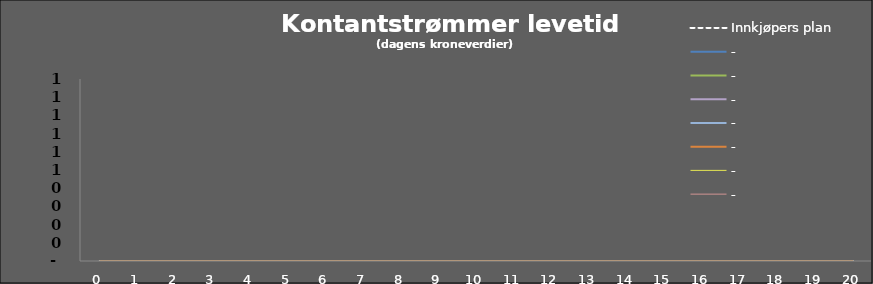
| Category |  Innkjøpers plan  |  -    |
|---|---|---|
| 0 | 0 | 0 |
| 1 | 0 | 0 |
| 2 | 0 | 0 |
| 3 | 0 | 0 |
| 4 | 0 | 0 |
| 5 | 0 | 0 |
| 6 | 0 | 0 |
| 7 | 0 | 0 |
| 8 | 0 | 0 |
| 9 | 0 | 0 |
| 10 | 0 | 0 |
| 11 | 0 | 0 |
| 12 | 0 | 0 |
| 13 | 0 | 0 |
| 14 | 0 | 0 |
| 15 | 0 | 0 |
| 16 | 0 | 0 |
| 17 | 0 | 0 |
| 18 | 0 | 0 |
| 19 | 0 | 0 |
| 20 | 0 | 0 |